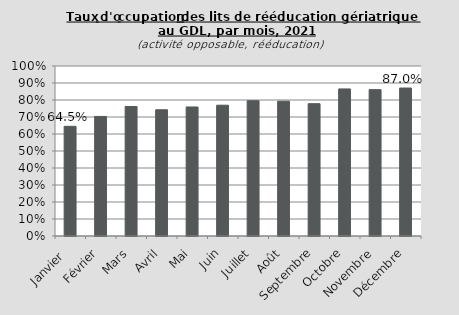
| Category | Series 0 |
|---|---|
| Janvier  | 0.645 |
| Février | 0.703 |
| Mars | 0.762 |
| Avril | 0.743 |
| Mai | 0.759 |
| Juin | 0.769 |
| Juillet | 0.796 |
| Août | 0.793 |
| Septembre | 0.778 |
| Octobre | 0.865 |
| Novembre | 0.861 |
| Décembre | 0.87 |